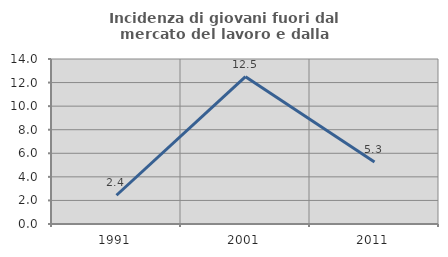
| Category | Incidenza di giovani fuori dal mercato del lavoro e dalla formazione  |
|---|---|
| 1991.0 | 2.439 |
| 2001.0 | 12.5 |
| 2011.0 | 5.263 |